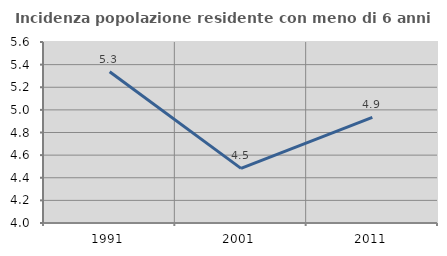
| Category | Incidenza popolazione residente con meno di 6 anni |
|---|---|
| 1991.0 | 5.337 |
| 2001.0 | 4.483 |
| 2011.0 | 4.933 |